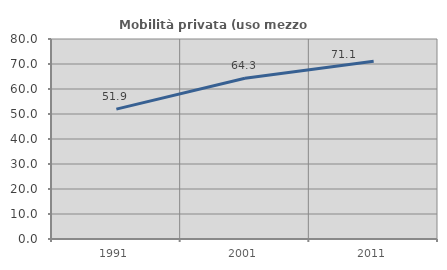
| Category | Mobilità privata (uso mezzo privato) |
|---|---|
| 1991.0 | 51.942 |
| 2001.0 | 64.318 |
| 2011.0 | 71.081 |